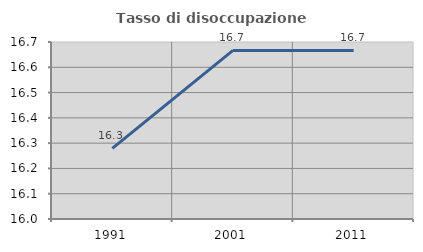
| Category | Tasso di disoccupazione giovanile  |
|---|---|
| 1991.0 | 16.279 |
| 2001.0 | 16.667 |
| 2011.0 | 16.667 |